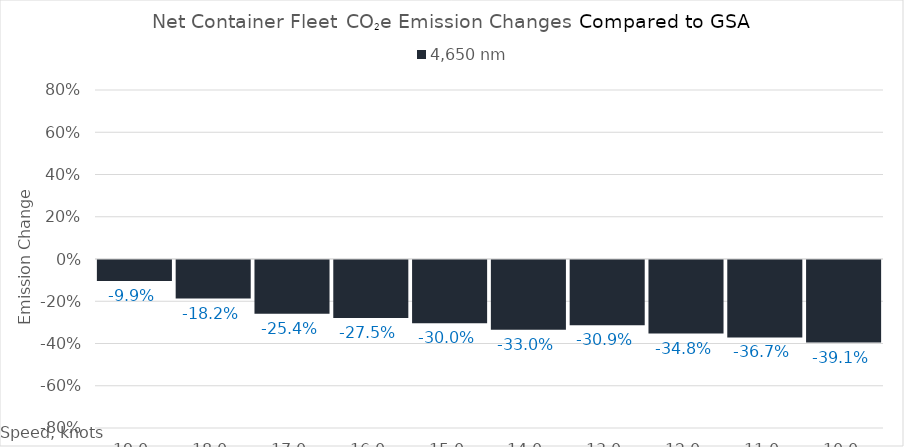
| Category | 4,650 |
|---|---|
| 19.0 | -0.099 |
| 18.0 | -0.182 |
| 17.0 | -0.254 |
| 16.0 | -0.275 |
| 15.0 | -0.3 |
| 14.0 | -0.33 |
| 13.0 | -0.309 |
| 12.0 | -0.348 |
| 11.0 | -0.367 |
| 10.0 | -0.391 |